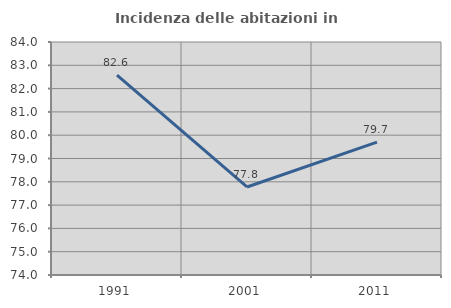
| Category | Incidenza delle abitazioni in proprietà  |
|---|---|
| 1991.0 | 82.576 |
| 2001.0 | 77.778 |
| 2011.0 | 79.701 |